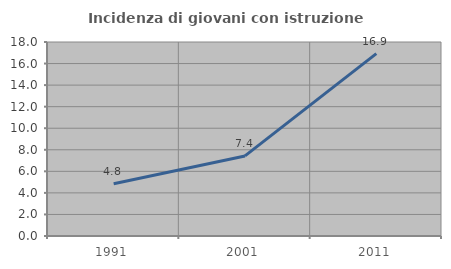
| Category | Incidenza di giovani con istruzione universitaria |
|---|---|
| 1991.0 | 4.842 |
| 2001.0 | 7.429 |
| 2011.0 | 16.92 |